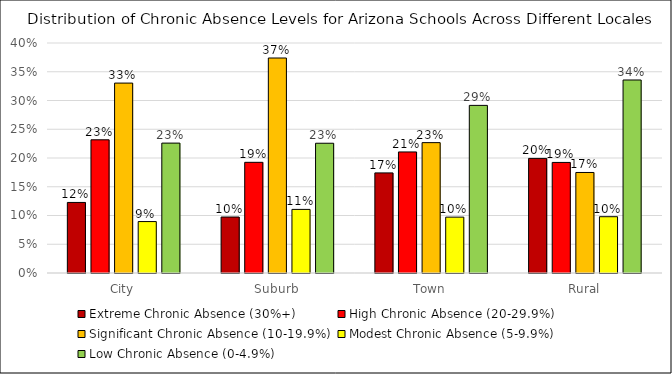
| Category | Extreme Chronic Absence (30%+) | High Chronic Absence (20-29.9%) | Significant Chronic Absence (10-19.9%) | Modest Chronic Absence (5-9.9%) | Low Chronic Absence (0-4.9%) |
|---|---|---|---|---|---|
| City | 0.123 | 0.232 | 0.33 | 0.089 | 0.226 |
| Suburb | 0.097 | 0.192 | 0.374 | 0.111 | 0.226 |
| Town | 0.174 | 0.211 | 0.227 | 0.097 | 0.291 |
| Rural | 0.199 | 0.192 | 0.175 | 0.098 | 0.336 |